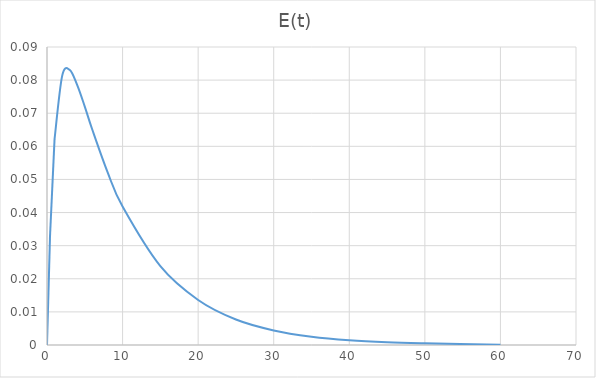
| Category | E(t) |
|---|---|
| 0.0 | 0 |
| 0.4 | 0.033 |
| 1.0 | 0.062 |
| 2.0 | 0.081 |
| 3.0 | 0.083 |
| 4.0 | 0.078 |
| 5.0 | 0.072 |
| 6.0 | 0.065 |
| 8.0 | 0.052 |
| 10.0 | 0.042 |
| 15.0 | 0.024 |
| 20.0 | 0.014 |
| 25.0 | 0.008 |
| 30.0 | 0.004 |
| 35.0 | 0.002 |
| 40.0 | 0.001 |
| 45.0 | 0.001 |
| 50.0 | 0 |
| 60.0 | 0 |